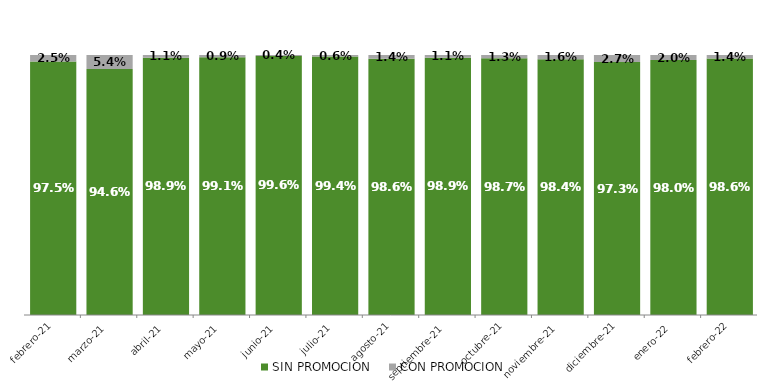
| Category | SIN PROMOCION   | CON PROMOCION   |
|---|---|---|
| 2021-02-01 | 0.975 | 0.025 |
| 2021-03-01 | 0.946 | 0.054 |
| 2021-04-01 | 0.989 | 0.011 |
| 2021-05-01 | 0.991 | 0.009 |
| 2021-06-01 | 0.996 | 0.004 |
| 2021-07-01 | 0.994 | 0.006 |
| 2021-08-01 | 0.986 | 0.014 |
| 2021-09-01 | 0.989 | 0.011 |
| 2021-10-01 | 0.987 | 0.013 |
| 2021-11-01 | 0.984 | 0.016 |
| 2021-12-01 | 0.973 | 0.027 |
| 2022-01-01 | 0.98 | 0.02 |
| 2022-02-01 | 0.986 | 0.014 |